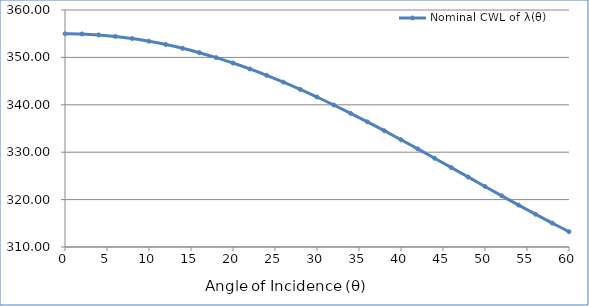
| Category | Nominal CWL of λ(θ) |
|---|---|
| 0.0 | 355 |
| 2.0 | 354.936 |
| 4.0 | 354.745 |
| 6.0 | 354.427 |
| 8.0 | 353.983 |
| 10.0 | 353.416 |
| 12.0 | 352.726 |
| 14.0 | 351.918 |
| 16.0 | 350.994 |
| 18.0 | 349.958 |
| 20.0 | 348.813 |
| 22.0 | 347.565 |
| 24.0 | 346.218 |
| 26.0 | 344.778 |
| 28.0 | 343.25 |
| 30.0 | 341.642 |
| 32.0 | 339.959 |
| 34.0 | 338.209 |
| 36.0 | 336.399 |
| 38.0 | 334.538 |
| 40.0 | 332.633 |
| 42.0 | 330.694 |
| 44.0 | 328.729 |
| 46.0 | 326.747 |
| 48.0 | 324.758 |
| 50.0 | 322.771 |
| 52.0 | 320.797 |
| 54.0 | 318.844 |
| 56.0 | 316.924 |
| 58.0 | 315.046 |
| 60.0 | 313.221 |